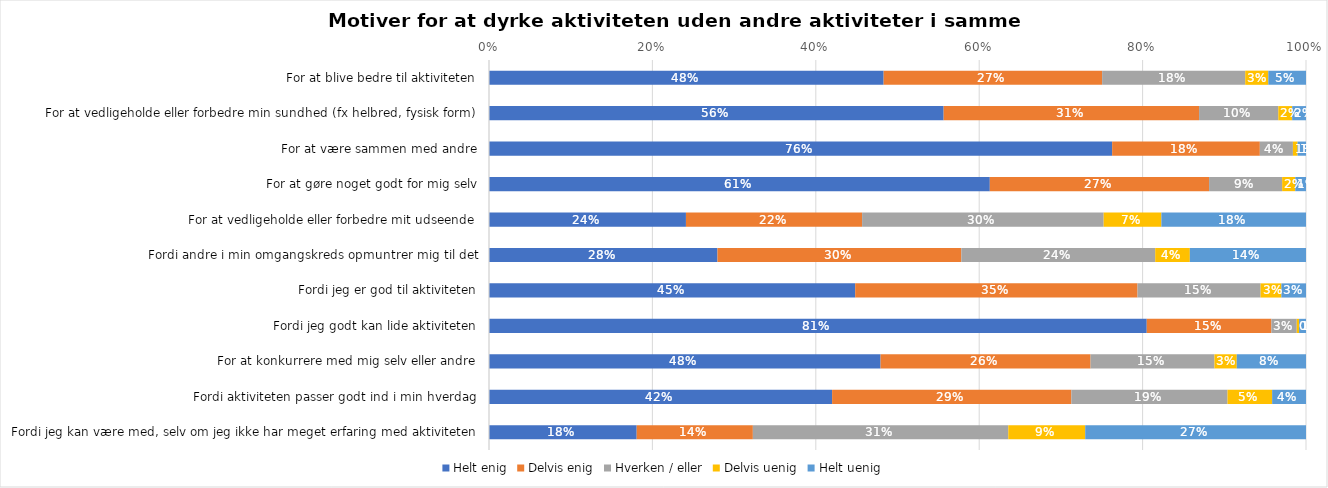
| Category | Helt enig | Delvis enig | Hverken / eller | Delvis uenig | Helt uenig |
|---|---|---|---|---|---|
| For at blive bedre til aktiviteten | 0.483 | 0.267 | 0.175 | 0.028 | 0.046 |
| For at vedligeholde eller forbedre min sundhed (fx helbred, fysisk form) | 0.556 | 0.313 | 0.097 | 0.017 | 0.017 |
| For at være sammen med andre | 0.763 | 0.181 | 0.04 | 0.006 | 0.01 |
| For at gøre noget godt for mig selv | 0.613 | 0.268 | 0.089 | 0.016 | 0.013 |
| For at vedligeholde eller forbedre mit udseende | 0.241 | 0.216 | 0.296 | 0.071 | 0.177 |
| Fordi andre i min omgangskreds opmuntrer mig til det | 0.28 | 0.298 | 0.237 | 0.042 | 0.142 |
| Fordi jeg er god til aktiviteten | 0.448 | 0.346 | 0.151 | 0.025 | 0.03 |
| Fordi jeg godt kan lide aktiviteten | 0.805 | 0.153 | 0.031 | 0.003 | 0.008 |
| For at konkurrere med mig selv eller andre | 0.479 | 0.257 | 0.152 | 0.027 | 0.085 |
| Fordi aktiviteten passer godt ind i min hverdag | 0.42 | 0.293 | 0.191 | 0.055 | 0.041 |
| Fordi jeg kan være med, selv om jeg ikke har meget erfaring med aktiviteten | 0.181 | 0.142 | 0.313 | 0.094 | 0.27 |